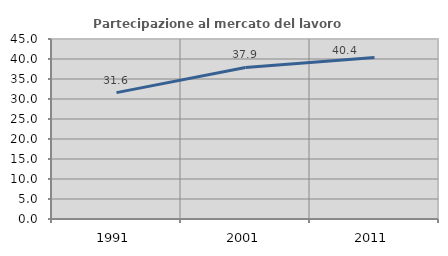
| Category | Partecipazione al mercato del lavoro  femminile |
|---|---|
| 1991.0 | 31.588 |
| 2001.0 | 37.886 |
| 2011.0 | 40.379 |